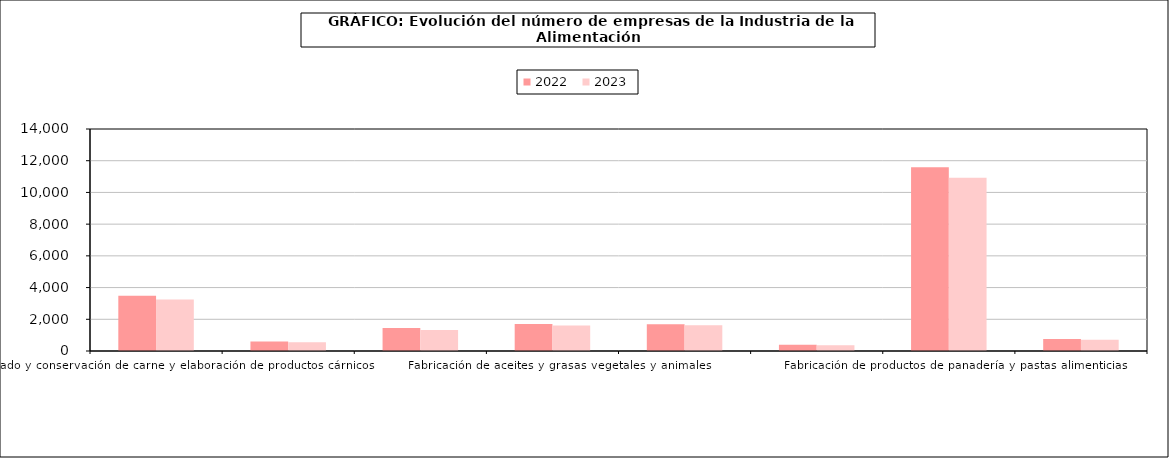
| Category | 2022 | 2023 |
|---|---|---|
| Procesado y conservación de carne y elaboración de productos cárnicos | 3477 | 3244 |
| Procesado y conservación de pescados, crustáceos y moluscos | 599 | 550 |
| Procesado y conservación de frutas y hortalizas | 1445 | 1318 |
| Fabricación de aceites y grasas vegetales y animales | 1707 | 1609 |
| Fabricación de productos lácteos | 1694 | 1620 |
| Fabricación de productos de molinería, almidones y productos amiláceos | 389 | 363 |
| Fabricación de productos de panadería y pastas alimenticias | 11591 | 10924 |
| Fabricación de productos para la alimentación animal | 759 | 716 |